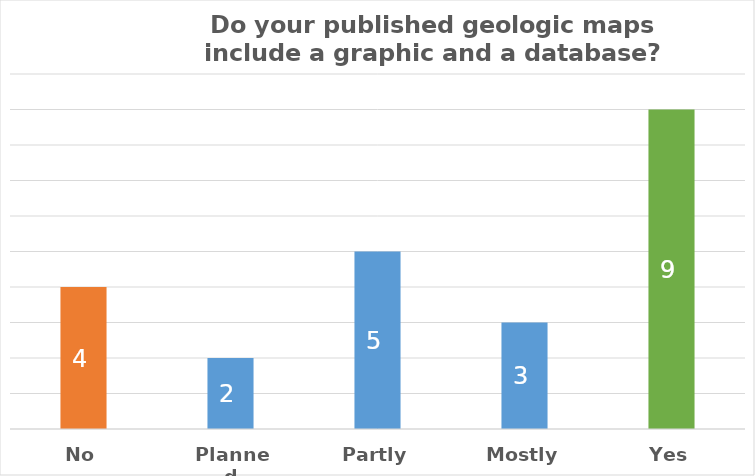
| Category | Total |
|---|---|
| No | 4 |
| Planned | 2 |
| Partly | 5 |
| Mostly | 3 |
| Yes | 9 |